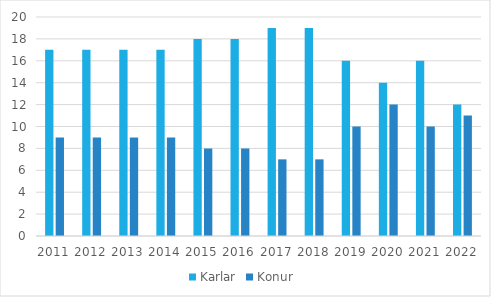
| Category | Karlar | Konur  |
|---|---|---|
| 2011.0 | 17 | 9 |
| 2012.0 | 17 | 9 |
| 2013.0 | 17 | 9 |
| 2014.0 | 17 | 9 |
| 2015.0 | 18 | 8 |
| 2016.0 | 18 | 8 |
| 2017.0 | 19 | 7 |
| 2018.0 | 19 | 7 |
| 2019.0 | 16 | 10 |
| 2020.0 | 14 | 12 |
| 2021.0 | 16 | 10 |
| 2022.0 | 12 | 11 |